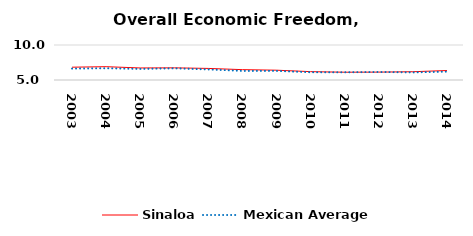
| Category | Sinaloa | Mexican Average  |
|---|---|---|
| 2003.0 | 6.829 | 6.632 |
| 2004.0 | 6.9 | 6.678 |
| 2005.0 | 6.721 | 6.582 |
| 2006.0 | 6.737 | 6.668 |
| 2007.0 | 6.652 | 6.508 |
| 2008.0 | 6.478 | 6.3 |
| 2009.0 | 6.4 | 6.3 |
| 2010.0 | 6.193 | 6.105 |
| 2011.0 | 6.113 | 6.103 |
| 2012.0 | 6.125 | 6.144 |
| 2013.0 | 6.182 | 6.087 |
| 2014.0 | 6.353 | 6.195 |